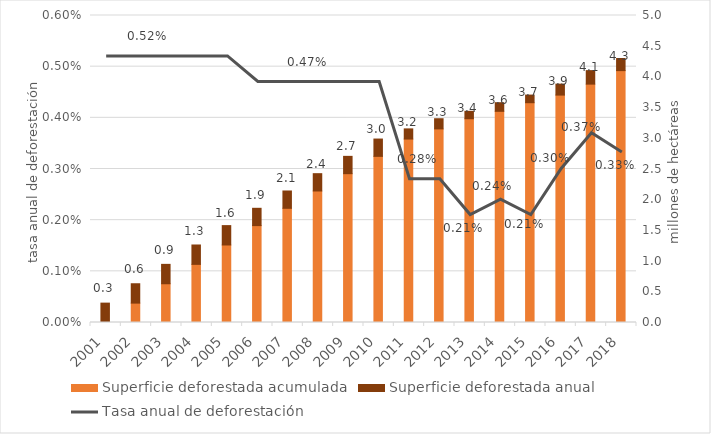
| Category | Superficie deforestada acumulada  | Superficie deforestada anual  |
|---|---|---|
| 2001.0 | 0 | 0.316 |
| 2002.0 | 0.316 | 0.316 |
| 2003.0 | 0.631 | 0.316 |
| 2004.0 | 0.947 | 0.316 |
| 2005.0 | 1.262 | 0.316 |
| 2006.0 | 1.578 | 0.282 |
| 2007.0 | 1.86 | 0.282 |
| 2008.0 | 2.142 | 0.282 |
| 2009.0 | 2.424 | 0.282 |
| 2010.0 | 2.706 | 0.282 |
| 2011.0 | 2.988 | 0.165 |
| 2012.0 | 3.153 | 0.165 |
| 2013.0 | 3.319 | 0.121 |
| 2014.0 | 3.439 | 0.14 |
| 2015.0 | 3.58 | 0.124 |
| 2016.0 | 3.704 | 0.179 |
| 2017.0 | 3.882 | 0.22 |
| 2018.0 | 4.102 | 0.197 |